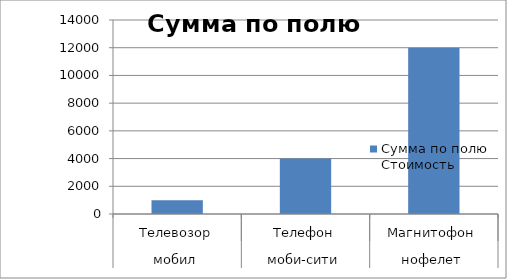
| Category | Итог |
|---|---|
| 0 | 1000 |
| 1 | 4000 |
| 2 | 12000 |